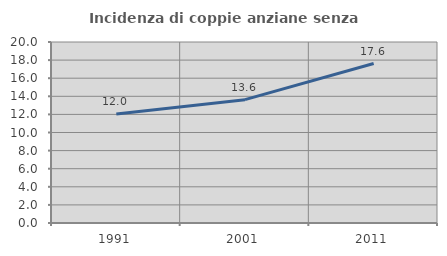
| Category | Incidenza di coppie anziane senza figli  |
|---|---|
| 1991.0 | 12.035 |
| 2001.0 | 13.629 |
| 2011.0 | 17.619 |